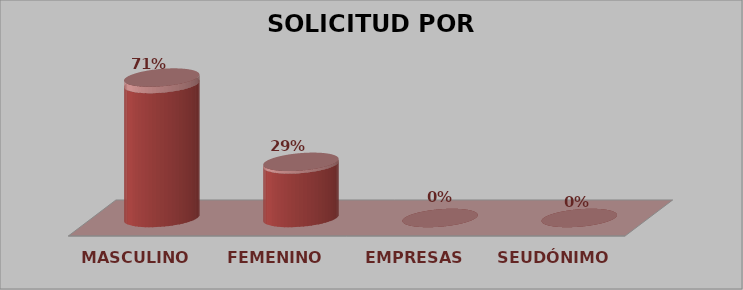
| Category | SOLICITUD POR GÉNERO | Series 1 |
|---|---|---|
| MASCULINO | 15 | 0.714 |
| FEMENINO | 6 | 0.286 |
| EMPRESAS | 0 | 0 |
| SEUDÓNIMO | 0 | 0 |